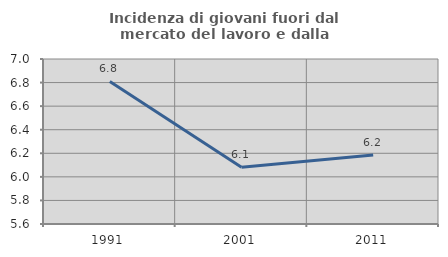
| Category | Incidenza di giovani fuori dal mercato del lavoro e dalla formazione  |
|---|---|
| 1991.0 | 6.809 |
| 2001.0 | 6.082 |
| 2011.0 | 6.186 |